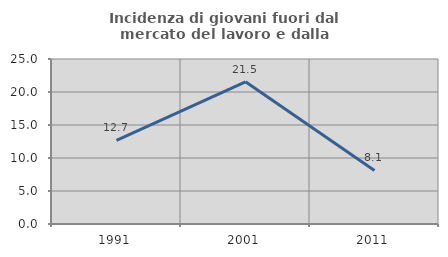
| Category | Incidenza di giovani fuori dal mercato del lavoro e dalla formazione  |
|---|---|
| 1991.0 | 12.658 |
| 2001.0 | 21.538 |
| 2011.0 | 8.108 |